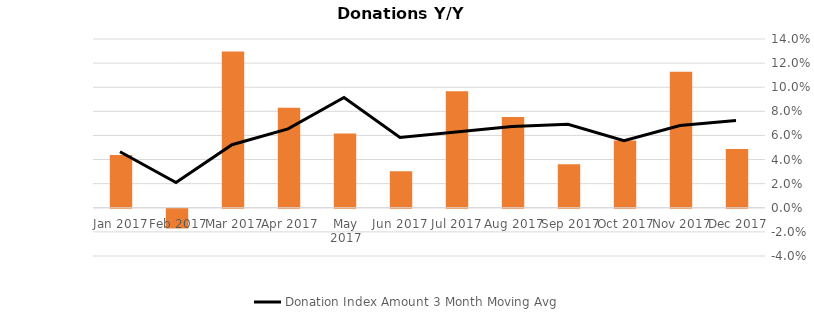
| Category | Series 0 |
|---|---|
| Dec 2017 | 0.049 |
| Nov 2017 | 0.113 |
| Oct 2017 | 0.056 |
| Sep 2017 | 0.036 |
| Aug 2017 | 0.075 |
| Jul 2017 | 0.097 |
| Jun 2017 | 0.03 |
| May 2017 | 0.062 |
| Apr 2017 | 0.083 |
| Mar 2017 | 0.13 |
| Feb 2017 | -0.016 |
| Jan 2017 | 0.044 |